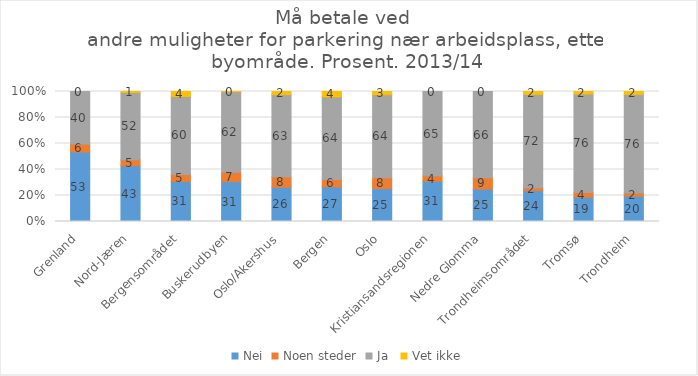
| Category | Nei | Noen steder | Ja  | Vet ikke |
|---|---|---|---|---|
| Grenland | 53.4 | 6.2 | 40.4 | 0 |
| Nord-Jæren | 42.9 | 4.7 | 51.7 | 0.8 |
| Bergensområdet | 30.8 | 5.4 | 60 | 3.8 |
| Buskerudbyen | 30.7 | 7.1 | 62 | 0.2 |
| Oslo/Akershus | 26.4 | 8 | 63.2 | 2.4 |
| Bergen | 26.7 | 5.6 | 63.6 | 4.1 |
| Oslo | 25.3 | 8.3 | 63.9 | 2.5 |
| Kristiansandsregionen | 30.9 | 4.3 | 64.8 | 0 |
| Nedre Glomma | 24.9 | 8.8 | 66.2 | 0 |
| Trondheimsområdet | 23.7 | 2.2 | 71.8 | 2.2 |
| Tromsø | 18.7 | 3.7 | 75.8 | 1.9 |
| Trondheim | 19.5 | 2.4 | 75.9 | 2.2 |